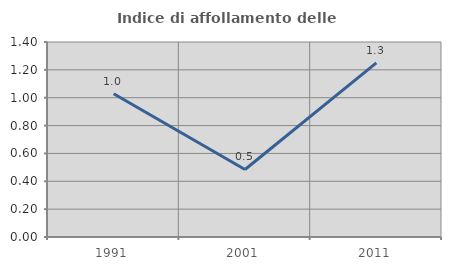
| Category | Indice di affollamento delle abitazioni  |
|---|---|
| 1991.0 | 1.029 |
| 2001.0 | 0.485 |
| 2011.0 | 1.251 |